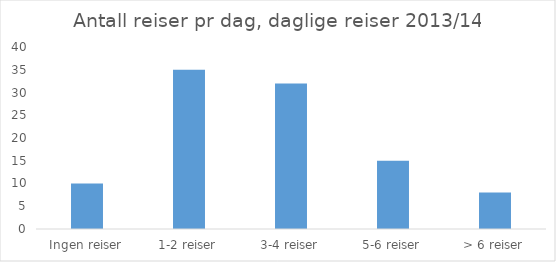
| Category | Andel av befolk-ningen (i %) |
|---|---|
| Ingen reiser | 10 |
| 1-2 reiser | 35 |
| 3-4 reiser | 32 |
| 5-6 reiser | 15 |
| > 6 reiser | 8 |